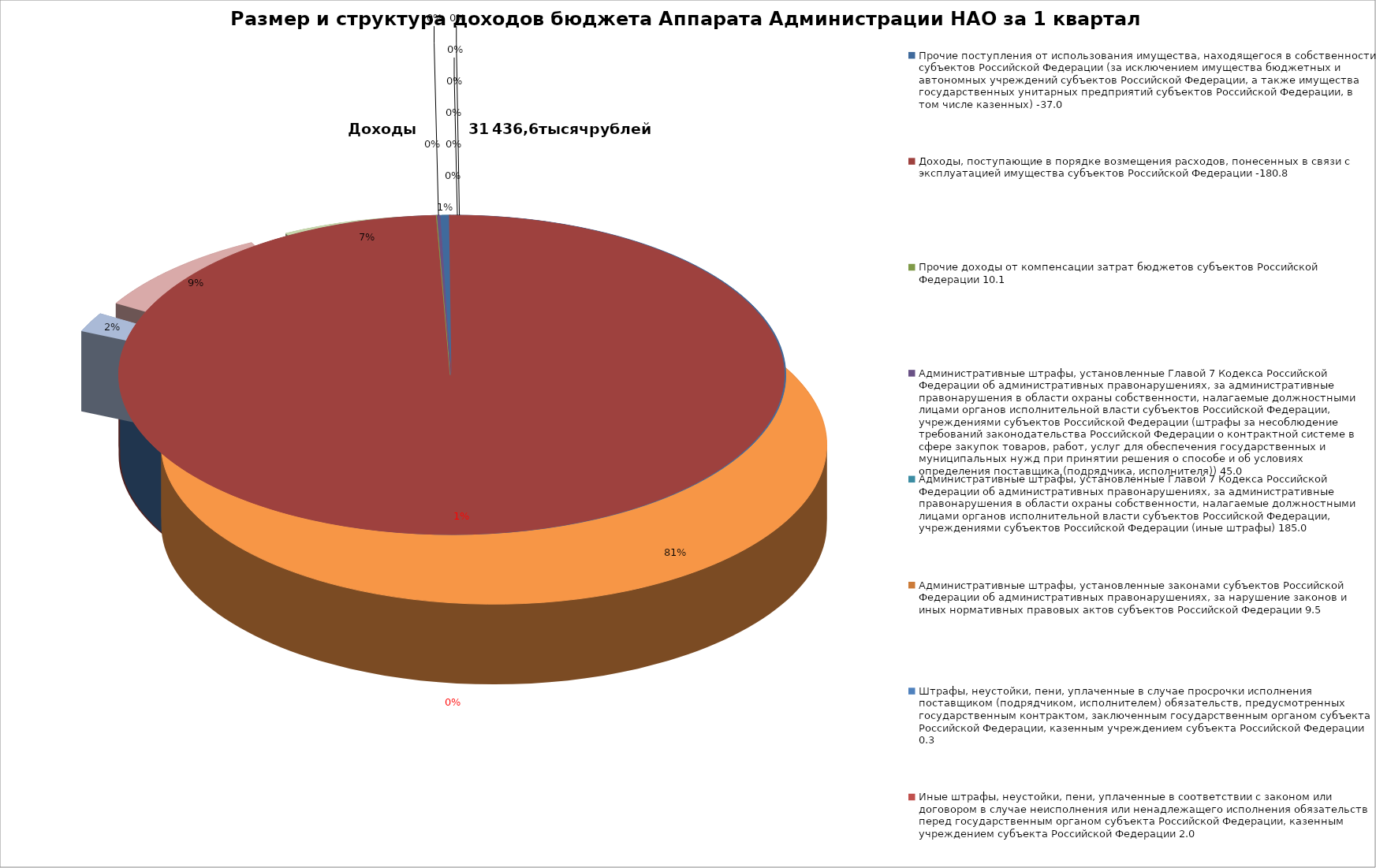
| Category | Размер и структура доходов бюджета Аппарата Администрации НАО за 1 квартал 2020г. |
|---|---|
| 0 | -37 |
| 1 | -180.8 |
| 2 | 10.1 |
| 3 | 45 |
| 4 | 185 |
| 5 | 9.5 |
| 6 | 0.3 |
| 7 | 2 |
| 8 | 12.7 |
| 9 | 7.8 |
| 10 | 42.8 |
| 11 | 26070.1 |
| 12 | 629.5 |
| 13 | 2885.2 |
| 14 | 2390.4 |